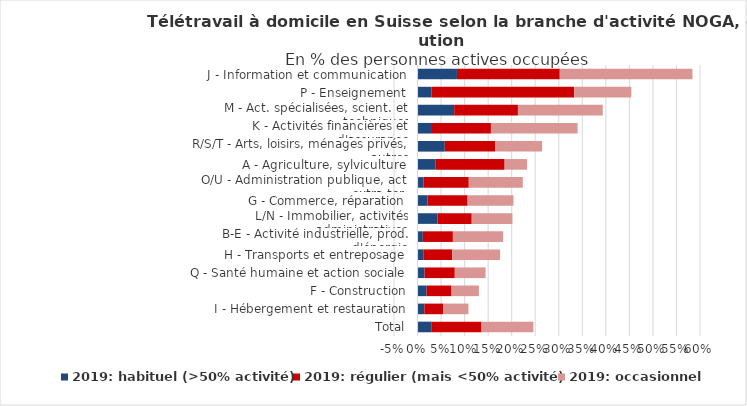
| Category | 2019: habituel (>50% activité) | 2019: régulier (mais <50% activité) | 2019: occasionnel  |
|---|---|---|---|
| Total | 0.03 | 0.106 | 0.11 |
| I - Hébergement et restauration | 0.014 | 0.04 | 0.054 |
| F - Construction | 0.019 | 0.053 | 0.058 |
| Q - Santé humaine et action sociale | 0.015 | 0.064 | 0.065 |
| H - Transports et entreposage | 0.012 | 0.061 | 0.102 |
| B-E - Activité industrielle, prod. d'énergie | 0.011 | 0.064 | 0.107 |
| L/N - Immobilier, activités administratives | 0.043 | 0.073 | 0.086 |
| G - Commerce, réparation | 0.021 | 0.085 | 0.097 |
| O/U - Administration publique, act. extra-ter. | 0.013 | 0.096 | 0.115 |
| A - Agriculture, sylviculture | 0.038 | 0.147 | 0.048 |
| R/S/T - Arts, loisirs, ménages privés, autres | 0.058 | 0.107 | 0.1 |
| K - Activités financières et d'assurance | 0.029 | 0.127 | 0.184 |
| M - Act. spécialisées, scient. et techniques | 0.078 | 0.135 | 0.18 |
| P - Enseignement | 0.03 | 0.303 | 0.121 |
| J - Information et communication | 0.084 | 0.218 | 0.282 |